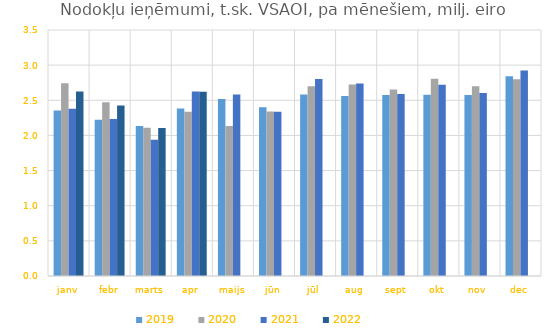
| Category | 2019 | 2020 | 2021 | 2022 |
|---|---|---|---|---|
| janv | 2.356 | 2.744 | 2.379 | 2.624 |
| febr | 2.224 | 2.471 | 2.232 | 2.426 |
| marts | 2.135 | 2.11 | 1.938 | 2.106 |
| apr | 2.385 | 2.336 | 2.626 | 2.623 |
| maijs | 2.517 | 2.132 | 2.583 | 0 |
| jūn | 2.4 | 2.34 | 2.335 | 0 |
| jūl | 2.582 | 2.7 | 2.802 | 0 |
| aug | 2.562 | 2.724 | 2.739 | 0 |
| sept | 2.574 | 2.654 | 2.591 | 0 |
| okt | 2.579 | 2.805 | 2.722 | 0 |
| nov | 2.576 | 2.701 | 2.602 | 0 |
| dec | 2.842 | 2.801 | 2.925 | 0 |